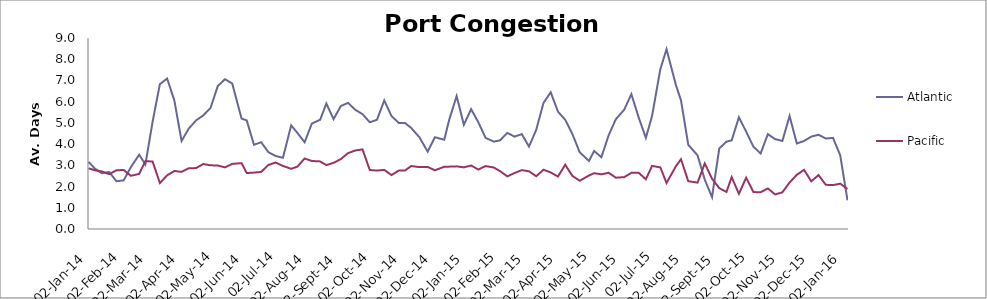
| Category | Atlantic  | Pacific |
|---|---|---|
| 2014-01-02 | 3.167 | 2.863 |
| 2014-01-08 | 2.854 | 2.767 |
| 2014-01-15 | 2.625 | 2.712 |
| 2014-01-22 | 2.688 | 2.582 |
| 2014-01-29 | 2.25 | 2.767 |
| 2014-02-05 | 2.292 | 2.781 |
| 2014-02-12 | 2.917 | 2.507 |
| 2014-02-20 | 3.5 | 2.596 |
| 2014-02-26 | 3.042 | 3.199 |
| 2014-03-05 | 5.059 | 3.178 |
| 2014-03-12 | 6.824 | 2.164 |
| 2014-03-19 | 7.088 | 2.527 |
| 2014-03-26 | 6.059 | 2.733 |
| 2014-04-02 | 4.147 | 2.692 |
| 2014-04-09 | 4.735 | 2.863 |
| 2014-04-16 | 5.118 | 2.87 |
| 2014-04-23 | 5.353 | 3.062 |
| 2014-04-30 | 5.706 | 3 |
| 2014-05-07 | 6.735 | 2.993 |
| 2014-05-14 | 7.059 | 2.904 |
| 2014-05-21 | 6.853 | 3.068 |
| 2014-05-30 | 5.206 | 3.103 |
| 2014-06-04 | 5.118 | 2.637 |
| 2014-06-11 | 3.971 | 2.658 |
| 2014-06-18 | 4.088 | 2.692 |
| 2014-06-25 | 3.618 | 3.021 |
| 2014-07-02 | 3.441 | 3.13 |
| 2014-07-09 | 3.353 | 2.973 |
| 2014-07-17 | 4.882 | 2.836 |
| 2014-07-23 | 4.529 | 2.938 |
| 2014-07-30 | 4.088 | 3.322 |
| 2014-08-06 | 4.971 | 3.205 |
| 2014-08-14 | 5.147 | 3.185 |
| 2014-08-20 | 5.912 | 3.014 |
| 2014-08-27 | 5.176 | 3.116 |
| 2014-09-03 | 5.794 | 3.295 |
| 2014-09-10 | 5.941 | 3.575 |
| 2014-09-17 | 5.618 | 3.699 |
| 2014-09-24 | 5.412 | 3.753 |
| 2014-10-01 | 5.029 | 2.781 |
| 2014-10-08 | 5.147 | 2.753 |
| 2014-10-15 | 6.059 | 2.785 |
| 2014-10-22 | 5.324 | 2.541 |
| 2014-10-29 | 5 | 2.753 |
| 2014-11-04 | 5 | 2.753 |
| 2014-11-10 | 4.765 | 2.966 |
| 2014-11-18 | 4.324 | 2.918 |
| 2014-11-26 | 3.647 | 2.925 |
| 2014-12-03 | 4.324 | 2.767 |
| 2014-12-12 | 4.206 | 2.932 |
| 2014-12-17 | 5.176 | 2.938 |
| 2014-12-24 | 6.265 | 2.952 |
| 2014-12-31 | 4.912 | 2.904 |
| 2015-01-07 | 5.647 | 2.993 |
| 2015-01-14 | 5.029 | 2.801 |
| 2015-01-21 | 4.294 | 2.966 |
| 2015-01-29 | 4.118 | 2.897 |
| 2015-02-04 | 4.176 | 2.726 |
| 2015-02-11 | 4.529 | 2.479 |
| 2015-02-18 | 4.353 | 2.637 |
| 2015-02-25 | 4.471 | 2.774 |
| 2015-03-04 | 3.882 | 2.719 |
| 2015-03-11 | 4.676 | 2.486 |
| 2015-03-18 | 5.941 | 2.795 |
| 2015-03-25 | 6.441 | 2.664 |
| 2015-04-01 | 5.529 | 2.473 |
| 2015-04-08 | 5.147 | 3.027 |
| 2015-04-15 | 4.471 | 2.5 |
| 2015-04-22 | 3.618 | 2.274 |
| 2015-05-01 | 3.206 | 2.521 |
| 2015-05-06 | 3.676 | 2.63 |
| 2015-05-13 | 3.382 | 2.575 |
| 2015-05-20 | 4.412 | 2.651 |
| 2015-05-27 | 5.176 | 2.418 |
| 2015-06-04 | 5.618 | 2.442 |
| 2015-06-11 | 6.353 | 2.645 |
| 2015-06-18 | 5.265 | 2.651 |
| 2015-06-25 | 4.294 | 2.342 |
| 2015-07-01 | 5.324 | 2.973 |
| 2015-07-09 | 7.529 | 2.904 |
| 2015-07-15 | 8.471 | 2.168 |
| 2015-07-24 | 6.794 | 2.952 |
| 2015-07-29 | 6.059 | 3.288 |
| 2015-08-05 | 3.971 | 2.253 |
| 2015-08-14 | 3.471 | 2.185 |
| 2015-08-21 | 2.324 | 3.089 |
| 2015-08-28 | 1.5 | 2.37 |
| 2015-09-04 | 3.794 | 1.925 |
| 2015-09-11 | 4.118 | 1.747 |
| 2015-09-16 | 4.176 | 2.445 |
| 2015-09-23 | 5.265 | 1.658 |
| 2015-09-30 | 4.588 | 2.418 |
| 2015-10-07 | 3.882 | 1.74 |
| 2015-10-14 | 3.559 | 1.733 |
| 2015-10-21 | 4.471 | 1.911 |
| 2015-10-28 | 4.235 | 1.63 |
| 2015-11-04 | 4.147 | 1.726 |
| 2015-11-11 | 5.324 | 2.192 |
| 2015-11-18 | 4.029 | 2.555 |
| 2015-11-25 | 4.147 | 2.788 |
| 2015-12-02 | 4.353 | 2.247 |
| 2015-12-09 | 4.441 | 2.541 |
| 2015-12-16 | 4.265 | 2.082 |
| 2015-12-23 | 4.294 | 2.068 |
| 2015-12-30 | 3.471 | 2.137 |
| 2016-01-06 | 1.353 | 1.884 |